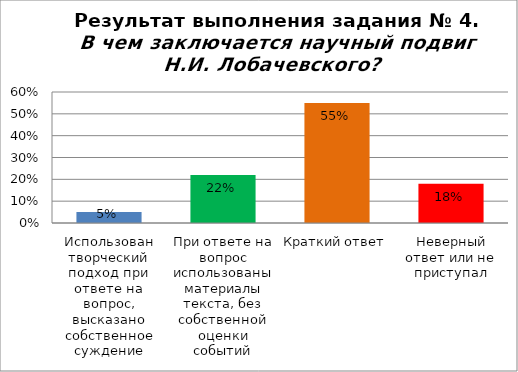
| Category | В чем заключается научный подвиг Н.И. Лобачевского? |
|---|---|
| Использован творческий подход при ответе на вопрос, высказано собственное суждение | 0.05 |
| При ответе на вопрос использованы материалы текста, без собственной оценки событий | 0.22 |
| Краткий ответ | 0.55 |
| Неверный ответ или не приступал | 0.18 |